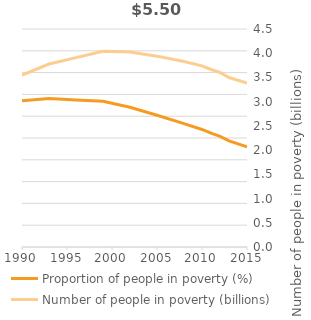
| Category | Proportion of people in poverty (%) |
|---|---|
| 1990.0 | 0.671 |
| 1993.0 | 0.681 |
| 1996.0 | 0.674 |
| 1999.0 | 0.668 |
| 2002.0 | 0.641 |
| 2005.0 | 0.604 |
| 2008.0 | 0.566 |
| 2010.0 | 0.539 |
| 2011.0 | 0.522 |
| 2012.0 | 0.508 |
| 2013.0 | 0.487 |
| 2015.0 | 0.46 |